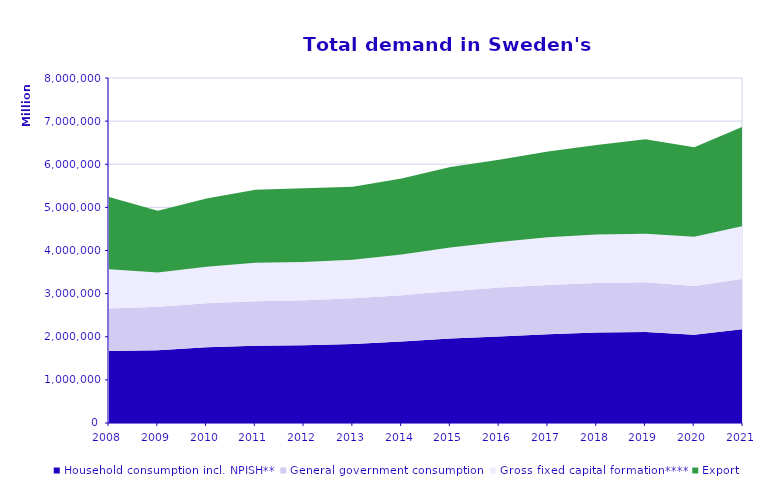
| Category | Household consumption incl. NPISH** | General government consumption | Gross fixed capital formation**** | Export |
|---|---|---|---|---|
| 2008.0 | 1666901 | 986883 | 913267 | 1671736 |
| 2009.0 | 1684204 | 1009101 | 797593 | 1430036 |
| 2010.0 | 1754421 | 1022388 | 847345 | 1582295 |
| 2011.0 | 1789341 | 1031256 | 897780 | 1688622 |
| 2012.0 | 1802428 | 1042589 | 888104 | 1707548 |
| 2013.0 | 1834754 | 1059178 | 892874 | 1688718 |
| 2014.0 | 1887573 | 1072391 | 946693 | 1762447 |
| 2015.0 | 1961665 | 1095716 | 1012008 | 1864670 |
| 2016.0 | 2006800 | 1136611 | 1052903 | 1909418 |
| 2017.0 | 2059110 | 1137995 | 1111301 | 1988308 |
| 2018.0 | 2097193 | 1147301 | 1126924 | 2072751 |
| 2019.0 | 2112297 | 1150364 | 1123128 | 2196577 |
| 2020.0 | 2045389 | 1129918 | 1141884 | 2076769 |
| 2021.0 | 2174766 | 1166872 | 1222950 | 2307776 |